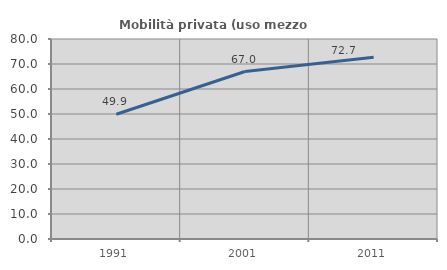
| Category | Mobilità privata (uso mezzo privato) |
|---|---|
| 1991.0 | 49.918 |
| 2001.0 | 66.983 |
| 2011.0 | 72.738 |